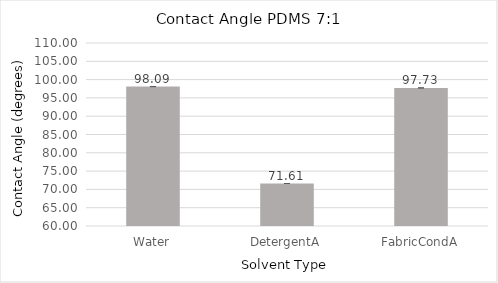
| Category | Series 0 |
|---|---|
| Water | 98.093 |
| DetergentA | 71.607 |
| FabricCondA | 97.733 |